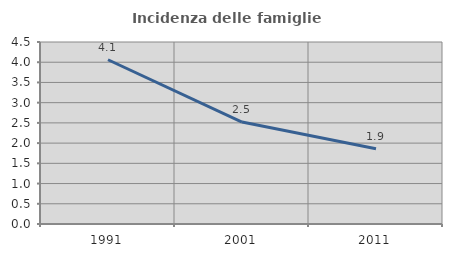
| Category | Incidenza delle famiglie numerose |
|---|---|
| 1991.0 | 4.061 |
| 2001.0 | 2.521 |
| 2011.0 | 1.859 |